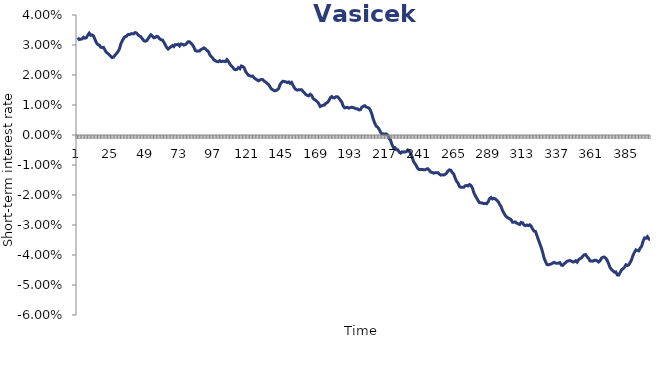
| Category | Series 0 |
|---|---|
| 0 | 0.032 |
| 1 | 0.032 |
| 2 | 0.032 |
| 3 | 0.032 |
| 4 | 0.033 |
| 5 | 0.032 |
| 6 | 0.032 |
| 7 | 0.033 |
| 8 | 0.034 |
| 9 | 0.033 |
| 10 | 0.033 |
| 11 | 0.033 |
| 12 | 0.032 |
| 13 | 0.031 |
| 14 | 0.03 |
| 15 | 0.03 |
| 16 | 0.029 |
| 17 | 0.029 |
| 18 | 0.029 |
| 19 | 0.028 |
| 20 | 0.028 |
| 21 | 0.027 |
| 22 | 0.027 |
| 23 | 0.026 |
| 24 | 0.026 |
| 25 | 0.026 |
| 26 | 0.027 |
| 27 | 0.027 |
| 28 | 0.028 |
| 29 | 0.029 |
| 30 | 0.03 |
| 31 | 0.031 |
| 32 | 0.032 |
| 33 | 0.033 |
| 34 | 0.033 |
| 35 | 0.033 |
| 36 | 0.033 |
| 37 | 0.034 |
| 38 | 0.034 |
| 39 | 0.034 |
| 40 | 0.034 |
| 41 | 0.034 |
| 42 | 0.033 |
| 43 | 0.033 |
| 44 | 0.033 |
| 45 | 0.032 |
| 46 | 0.031 |
| 47 | 0.031 |
| 48 | 0.031 |
| 49 | 0.032 |
| 50 | 0.033 |
| 51 | 0.033 |
| 52 | 0.033 |
| 53 | 0.032 |
| 54 | 0.032 |
| 55 | 0.033 |
| 56 | 0.033 |
| 57 | 0.032 |
| 58 | 0.032 |
| 59 | 0.032 |
| 60 | 0.031 |
| 61 | 0.03 |
| 62 | 0.029 |
| 63 | 0.029 |
| 64 | 0.029 |
| 65 | 0.029 |
| 66 | 0.03 |
| 67 | 0.029 |
| 68 | 0.03 |
| 69 | 0.03 |
| 70 | 0.03 |
| 71 | 0.03 |
| 72 | 0.03 |
| 73 | 0.03 |
| 74 | 0.03 |
| 75 | 0.03 |
| 76 | 0.031 |
| 77 | 0.031 |
| 78 | 0.031 |
| 79 | 0.031 |
| 80 | 0.03 |
| 81 | 0.029 |
| 82 | 0.028 |
| 83 | 0.028 |
| 84 | 0.028 |
| 85 | 0.028 |
| 86 | 0.029 |
| 87 | 0.029 |
| 88 | 0.029 |
| 89 | 0.029 |
| 90 | 0.028 |
| 91 | 0.028 |
| 92 | 0.027 |
| 93 | 0.026 |
| 94 | 0.026 |
| 95 | 0.025 |
| 96 | 0.025 |
| 97 | 0.024 |
| 98 | 0.024 |
| 99 | 0.025 |
| 100 | 0.024 |
| 101 | 0.025 |
| 102 | 0.025 |
| 103 | 0.024 |
| 104 | 0.025 |
| 105 | 0.025 |
| 106 | 0.024 |
| 107 | 0.023 |
| 108 | 0.023 |
| 109 | 0.022 |
| 110 | 0.022 |
| 111 | 0.022 |
| 112 | 0.022 |
| 113 | 0.022 |
| 114 | 0.023 |
| 115 | 0.023 |
| 116 | 0.022 |
| 117 | 0.021 |
| 118 | 0.021 |
| 119 | 0.02 |
| 120 | 0.02 |
| 121 | 0.02 |
| 122 | 0.02 |
| 123 | 0.019 |
| 124 | 0.019 |
| 125 | 0.018 |
| 126 | 0.018 |
| 127 | 0.018 |
| 128 | 0.019 |
| 129 | 0.018 |
| 130 | 0.018 |
| 131 | 0.018 |
| 132 | 0.017 |
| 133 | 0.017 |
| 134 | 0.016 |
| 135 | 0.015 |
| 136 | 0.015 |
| 137 | 0.015 |
| 138 | 0.015 |
| 139 | 0.015 |
| 140 | 0.015 |
| 141 | 0.017 |
| 142 | 0.018 |
| 143 | 0.018 |
| 144 | 0.018 |
| 145 | 0.018 |
| 146 | 0.017 |
| 147 | 0.018 |
| 148 | 0.017 |
| 149 | 0.018 |
| 150 | 0.017 |
| 151 | 0.016 |
| 152 | 0.015 |
| 153 | 0.015 |
| 154 | 0.015 |
| 155 | 0.015 |
| 156 | 0.015 |
| 157 | 0.015 |
| 158 | 0.014 |
| 159 | 0.013 |
| 160 | 0.013 |
| 161 | 0.013 |
| 162 | 0.014 |
| 163 | 0.013 |
| 164 | 0.012 |
| 165 | 0.012 |
| 166 | 0.011 |
| 167 | 0.011 |
| 168 | 0.01 |
| 169 | 0.01 |
| 170 | 0.01 |
| 171 | 0.01 |
| 172 | 0.01 |
| 173 | 0.011 |
| 174 | 0.011 |
| 175 | 0.011 |
| 176 | 0.012 |
| 177 | 0.013 |
| 178 | 0.012 |
| 179 | 0.012 |
| 180 | 0.013 |
| 181 | 0.013 |
| 182 | 0.012 |
| 183 | 0.012 |
| 184 | 0.011 |
| 185 | 0.01 |
| 186 | 0.009 |
| 187 | 0.009 |
| 188 | 0.009 |
| 189 | 0.009 |
| 190 | 0.009 |
| 191 | 0.009 |
| 192 | 0.009 |
| 193 | 0.009 |
| 194 | 0.009 |
| 195 | 0.009 |
| 196 | 0.008 |
| 197 | 0.008 |
| 198 | 0.009 |
| 199 | 0.01 |
| 200 | 0.01 |
| 201 | 0.009 |
| 202 | 0.009 |
| 203 | 0.009 |
| 204 | 0.008 |
| 205 | 0.007 |
| 206 | 0.005 |
| 207 | 0.004 |
| 208 | 0.003 |
| 209 | 0.003 |
| 210 | 0.002 |
| 211 | 0.001 |
| 212 | 0 |
| 213 | 0 |
| 214 | 0 |
| 215 | 0 |
| 216 | 0 |
| 217 | -0.001 |
| 218 | -0.002 |
| 219 | -0.003 |
| 220 | -0.004 |
| 221 | -0.004 |
| 222 | -0.005 |
| 223 | -0.005 |
| 224 | -0.006 |
| 225 | -0.006 |
| 226 | -0.006 |
| 227 | -0.006 |
| 228 | -0.006 |
| 229 | -0.006 |
| 230 | -0.005 |
| 231 | -0.005 |
| 232 | -0.006 |
| 233 | -0.007 |
| 234 | -0.009 |
| 235 | -0.01 |
| 236 | -0.01 |
| 237 | -0.011 |
| 238 | -0.012 |
| 239 | -0.012 |
| 240 | -0.011 |
| 241 | -0.012 |
| 242 | -0.012 |
| 243 | -0.011 |
| 244 | -0.011 |
| 245 | -0.012 |
| 246 | -0.012 |
| 247 | -0.012 |
| 248 | -0.013 |
| 249 | -0.013 |
| 250 | -0.013 |
| 251 | -0.013 |
| 252 | -0.013 |
| 253 | -0.013 |
| 254 | -0.013 |
| 255 | -0.013 |
| 256 | -0.013 |
| 257 | -0.013 |
| 258 | -0.012 |
| 259 | -0.012 |
| 260 | -0.012 |
| 261 | -0.013 |
| 262 | -0.013 |
| 263 | -0.014 |
| 264 | -0.015 |
| 265 | -0.016 |
| 266 | -0.017 |
| 267 | -0.017 |
| 268 | -0.017 |
| 269 | -0.017 |
| 270 | -0.017 |
| 271 | -0.017 |
| 272 | -0.017 |
| 273 | -0.017 |
| 274 | -0.017 |
| 275 | -0.018 |
| 276 | -0.019 |
| 277 | -0.02 |
| 278 | -0.021 |
| 279 | -0.022 |
| 280 | -0.023 |
| 281 | -0.023 |
| 282 | -0.023 |
| 283 | -0.023 |
| 284 | -0.023 |
| 285 | -0.023 |
| 286 | -0.022 |
| 287 | -0.021 |
| 288 | -0.021 |
| 289 | -0.021 |
| 290 | -0.021 |
| 291 | -0.021 |
| 292 | -0.022 |
| 293 | -0.022 |
| 294 | -0.023 |
| 295 | -0.024 |
| 296 | -0.025 |
| 297 | -0.026 |
| 298 | -0.027 |
| 299 | -0.027 |
| 300 | -0.028 |
| 301 | -0.028 |
| 302 | -0.028 |
| 303 | -0.029 |
| 304 | -0.029 |
| 305 | -0.029 |
| 306 | -0.029 |
| 307 | -0.03 |
| 308 | -0.03 |
| 309 | -0.029 |
| 310 | -0.029 |
| 311 | -0.03 |
| 312 | -0.03 |
| 313 | -0.03 |
| 314 | -0.03 |
| 315 | -0.03 |
| 316 | -0.03 |
| 317 | -0.031 |
| 318 | -0.032 |
| 319 | -0.032 |
| 320 | -0.034 |
| 321 | -0.035 |
| 322 | -0.036 |
| 323 | -0.037 |
| 324 | -0.039 |
| 325 | -0.041 |
| 326 | -0.042 |
| 327 | -0.043 |
| 328 | -0.043 |
| 329 | -0.043 |
| 330 | -0.043 |
| 331 | -0.043 |
| 332 | -0.042 |
| 333 | -0.043 |
| 334 | -0.043 |
| 335 | -0.043 |
| 336 | -0.043 |
| 337 | -0.043 |
| 338 | -0.043 |
| 339 | -0.043 |
| 340 | -0.043 |
| 341 | -0.042 |
| 342 | -0.042 |
| 343 | -0.042 |
| 344 | -0.042 |
| 345 | -0.042 |
| 346 | -0.042 |
| 347 | -0.042 |
| 348 | -0.042 |
| 349 | -0.042 |
| 350 | -0.041 |
| 351 | -0.041 |
| 352 | -0.04 |
| 353 | -0.04 |
| 354 | -0.04 |
| 355 | -0.041 |
| 356 | -0.041 |
| 357 | -0.042 |
| 358 | -0.042 |
| 359 | -0.042 |
| 360 | -0.042 |
| 361 | -0.042 |
| 362 | -0.042 |
| 363 | -0.042 |
| 364 | -0.042 |
| 365 | -0.041 |
| 366 | -0.041 |
| 367 | -0.041 |
| 368 | -0.041 |
| 369 | -0.042 |
| 370 | -0.043 |
| 371 | -0.044 |
| 372 | -0.045 |
| 373 | -0.045 |
| 374 | -0.046 |
| 375 | -0.046 |
| 376 | -0.047 |
| 377 | -0.047 |
| 378 | -0.046 |
| 379 | -0.045 |
| 380 | -0.045 |
| 381 | -0.044 |
| 382 | -0.043 |
| 383 | -0.043 |
| 384 | -0.043 |
| 385 | -0.042 |
| 386 | -0.042 |
| 387 | -0.04 |
| 388 | -0.039 |
| 389 | -0.038 |
| 390 | -0.039 |
| 391 | -0.039 |
| 392 | -0.038 |
| 393 | -0.037 |
| 394 | -0.035 |
| 395 | -0.034 |
| 396 | -0.034 |
| 397 | -0.034 |
| 398 | -0.035 |
| 399 | -0.035 |